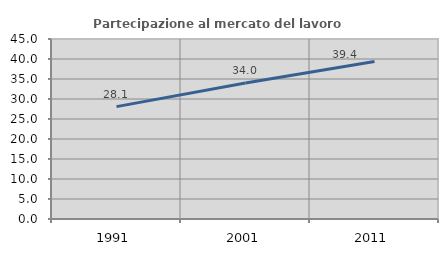
| Category | Partecipazione al mercato del lavoro  femminile |
|---|---|
| 1991.0 | 28.09 |
| 2001.0 | 34 |
| 2011.0 | 39.35 |